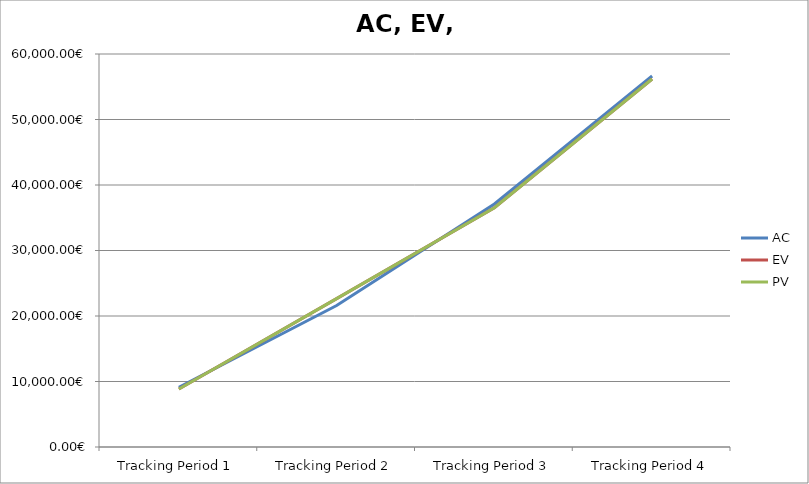
| Category | AC | EV | PV |
|---|---|---|---|
| Tracking Period 1 | 9128.68 | 8857.68 | 8857.68 |
| Tracking Period 2 | 21595.24 | 22656.24 | 22656.24 |
| Tracking Period 3 | 37093.79 | 36537.79 | 36537.79 |
| Tracking Period 4 | 56645.71 | 56182.71 | 56182.71 |